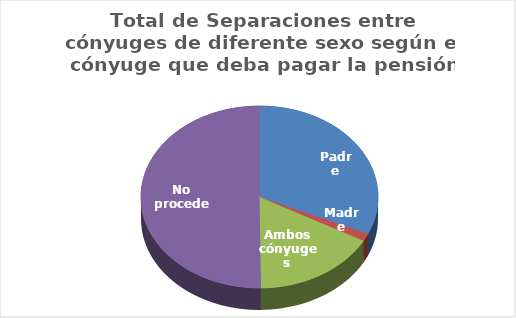
| Category | Series 0 |
|---|---|
| Padre | 1141 |
| Madre | 49 |
| Ambos cónyuges | 606 |
| No procede | 1810 |